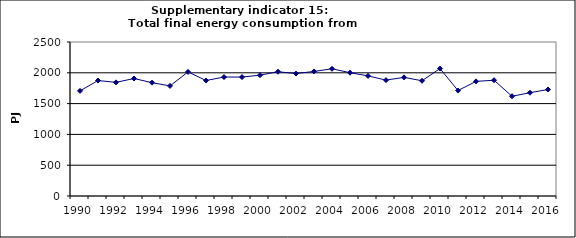
| Category | Total final energy consumption from households, PJ |
|---|---|
| 1990 | 1706.351 |
| 1991 | 1874.334 |
| 1992 | 1844.968 |
| 1993 | 1907.029 |
| 1994 | 1839.956 |
| 1995 | 1787.374 |
| 1996 | 2014.683 |
| 1997 | 1874.656 |
| 1998 | 1931.199 |
| 1999 | 1930.987 |
| 2000 | 1961.565 |
| 2001 | 2017.13 |
| 2002 | 1987.5 |
| 2003 | 2021.932 |
| 2004 | 2065.466 |
| 2005 | 2001.517 |
| 2006 | 1950.008 |
| 2007 | 1881.231 |
| 2008 | 1925.841 |
| 2009 | 1870.861 |
| 2010 | 2068.713 |
| 2011 | 1711.676 |
| 2012 | 1860.656 |
| 2013 | 1879.479 |
| 2014 | 1619.456 |
| 2015 | 1676.641 |
| 2016 | 1728.931 |